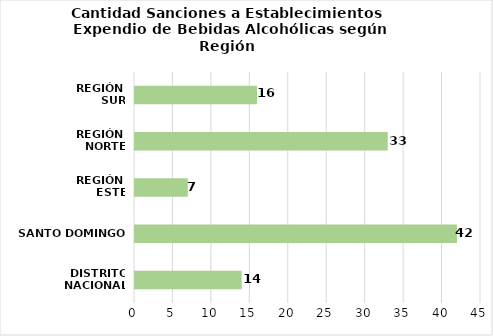
| Category | Series 0 |
|---|---|
| DISTRITO NACIONAL | 14 |
| SANTO DOMINGO | 42 |
| REGIÓN 
ESTE | 7 |
| REGIÓN 
NORTE | 33 |
| REGIÓN 
SUR | 16 |